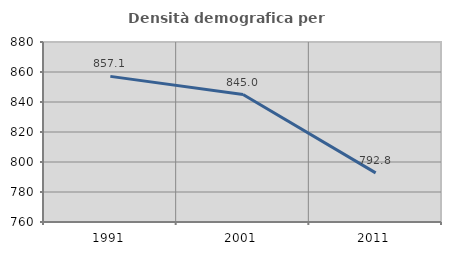
| Category | Densità demografica |
|---|---|
| 1991.0 | 857.082 |
| 2001.0 | 844.99 |
| 2011.0 | 792.765 |